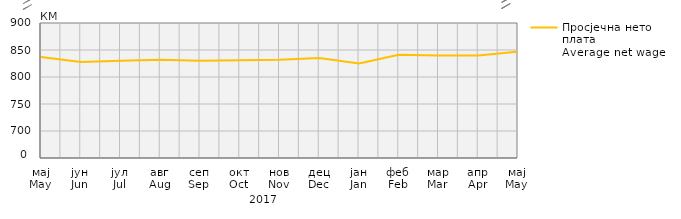
| Category | Просјечна нето плата
Average net wage |
|---|---|
| мај
May | 837 |
| јун
Jun | 828 |
| јул
Jul | 830 |
| авг
Aug | 832 |
| сеп
Sep | 830 |
| окт
Oct | 831 |
| нов
Nov | 832 |
| дец
Dec | 835 |
| јан
Jan | 825 |
| феб
Feb | 841 |
| мар
Mar | 840 |
| апр
Apr | 840 |
| мај
May | 847 |